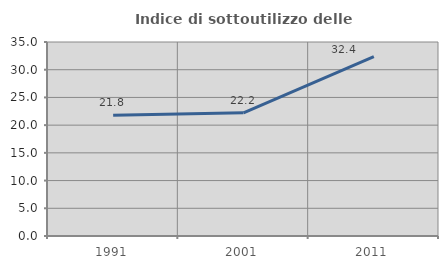
| Category | Indice di sottoutilizzo delle abitazioni  |
|---|---|
| 1991.0 | 21.771 |
| 2001.0 | 22.222 |
| 2011.0 | 32.374 |